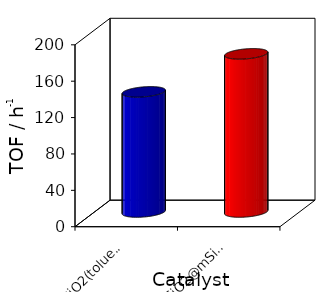
| Category | Series 0 |
|---|---|
| Fe3O4@nSiO2(toluene) | 132.096 |
| Fe3O4@nSiO2@mSiO2(toluene) | 173.893 |